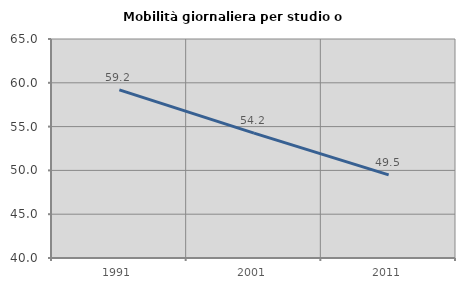
| Category | Mobilità giornaliera per studio o lavoro |
|---|---|
| 1991.0 | 59.186 |
| 2001.0 | 54.25 |
| 2011.0 | 49.492 |